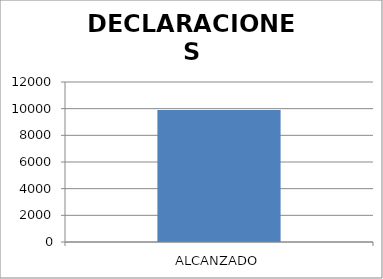
| Category | DECLARACIONES PATRIMONIALES |
|---|---|
| ALCANZADO | 9891 |